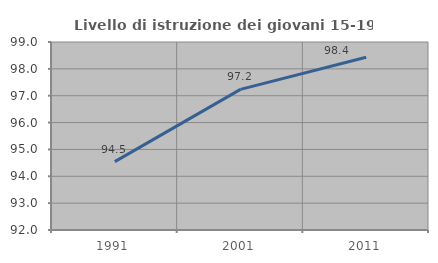
| Category | Livello di istruzione dei giovani 15-19 anni |
|---|---|
| 1991.0 | 94.545 |
| 2001.0 | 97.238 |
| 2011.0 | 98.429 |